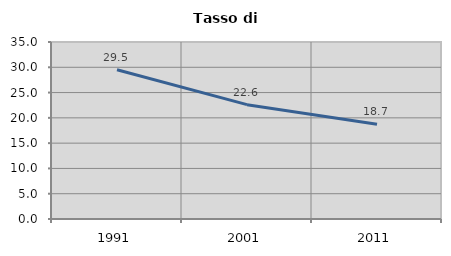
| Category | Tasso di disoccupazione   |
|---|---|
| 1991.0 | 29.518 |
| 2001.0 | 22.61 |
| 2011.0 | 18.726 |